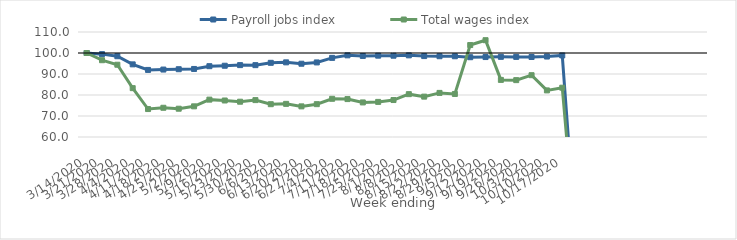
| Category | Payroll jobs index | Total wages index |
|---|---|---|
| 14/03/2020 | 100 | 100 |
| 21/03/2020 | 99.461 | 96.564 |
| 28/03/2020 | 98.464 | 94.418 |
| 04/04/2020 | 94.59 | 83.261 |
| 11/04/2020 | 91.938 | 73.305 |
| 18/04/2020 | 92.116 | 73.919 |
| 25/04/2020 | 92.278 | 73.471 |
| 02/05/2020 | 92.397 | 74.602 |
| 09/05/2020 | 93.721 | 77.792 |
| 16/05/2020 | 93.932 | 77.386 |
| 23/05/2020 | 94.228 | 76.801 |
| 30/05/2020 | 94.215 | 77.573 |
| 06/06/2020 | 95.323 | 75.621 |
| 13/06/2020 | 95.544 | 75.776 |
| 20/06/2020 | 94.893 | 74.586 |
| 27/06/2020 | 95.51 | 75.633 |
| 04/07/2020 | 97.677 | 78.194 |
| 11/07/2020 | 98.888 | 78.051 |
| 18/07/2020 | 98.592 | 76.462 |
| 25/07/2020 | 98.733 | 76.715 |
| 01/08/2020 | 98.71 | 77.598 |
| 08/08/2020 | 98.882 | 80.402 |
| 15/08/2020 | 98.532 | 79.226 |
| 22/08/2020 | 98.466 | 81.002 |
| 29/08/2020 | 98.447 | 80.493 |
| 05/09/2020 | 97.998 | 103.784 |
| 12/09/2020 | 98.067 | 106.096 |
| 19/09/2020 | 98.173 | 87.189 |
| 26/09/2020 | 98.141 | 87.076 |
| 03/10/2020 | 98.09 | 89.432 |
| 10/10/2020 | 98.312 | 82.193 |
| 17/10/2020 | 98.842 | 83.479 |